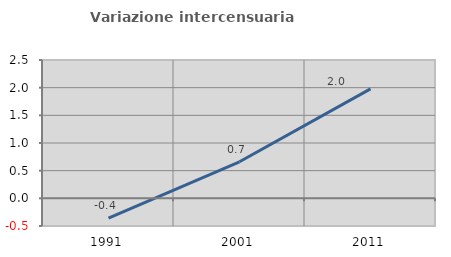
| Category | Variazione intercensuaria annua |
|---|---|
| 1991.0 | -0.36 |
| 2001.0 | 0.66 |
| 2011.0 | 1.977 |